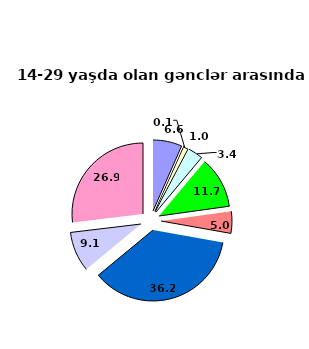
| Category | Series 0 |
|---|---|
| bəzi infeksion və parazitar xəstəliklər | 6.6 |
| yenitörəmələr -  | 0.1 |
| endokrin sisteminin xəstəlikləri, maddələr mübadiləsi və qidalanma pozğunluqları | 1 |
| qan, qanyaradıcı orqanların xəstəlikləri  -
 | 3.4 |
|  əsəb sistemi və hissiyyat orqanlarının xəstəlikləri  | 11.7 |
| qan dövranı sisteminin xəstəlikləri  | 5 |
| tənəffüs orqanlarının xəstəlikləri  | 36.2 |
|  həzm orqanlarının xəstəlikləri | 9.1 |
| digər  | 26.9 |